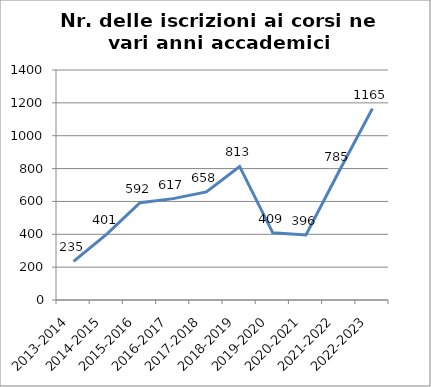
| Category | Nr. Iscrizioni ai Corsi |
|---|---|
| 2013-2014 | 235 |
| 2014-2015 | 401 |
| 2015-2016 | 592 |
| 2016-2017 | 617 |
| 2017-2018 | 658 |
| 2018-2019 | 813 |
| 2019-2020 | 409 |
| 2020-2021 | 396 |
| 2021-2022 | 785 |
| 2022-2023 | 1165 |